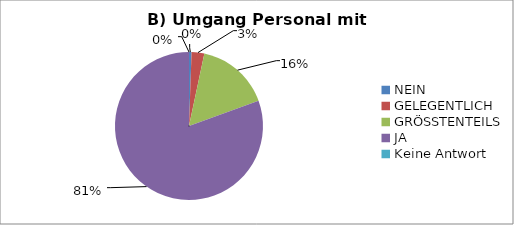
| Category | Series 0 |
|---|---|
| NEIN | 1 |
| GELEGENTLICH | 5 |
| GRÖSSTENTEILS | 29 |
| JA | 145 |
| Keine Antwort | 0 |